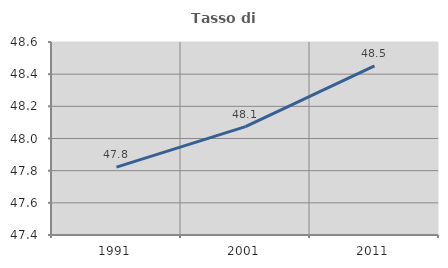
| Category | Tasso di occupazione   |
|---|---|
| 1991.0 | 47.822 |
| 2001.0 | 48.074 |
| 2011.0 | 48.452 |